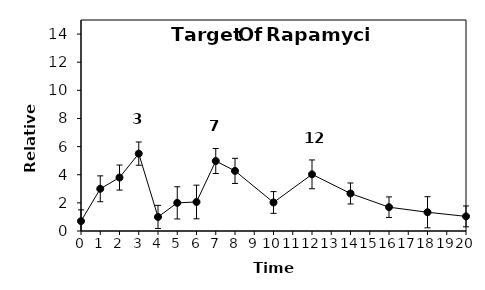
| Category | Series 0 |
|---|---|
| 0.0 | 0.7 |
| 1.0 | 3 |
| 2.0 | 3.8 |
| 3.0 | 5.5 |
| 4.0 | 1 |
| 5.0 | 2 |
| 6.0 | 2.063 |
| 7.0 | 4.976 |
| 8.0 | 4.272 |
| 10.0 | 2.028 |
| 12.0 | 4.028 |
| 14.0 | 2.667 |
| 16.0 | 1.693 |
| 18.0 | 1.333 |
| 20.0 | 1.039 |